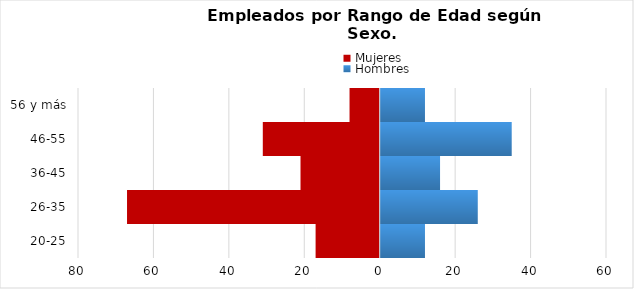
| Category | Mujeres | Hombres |
|---|---|---|
| 20-25 | -17 | 12 |
| 26-35 | -67 | 26 |
| 36-45 | -21 | 16 |
| 46-55 | -31 | 35 |
| 56 y más | -8 | 12 |